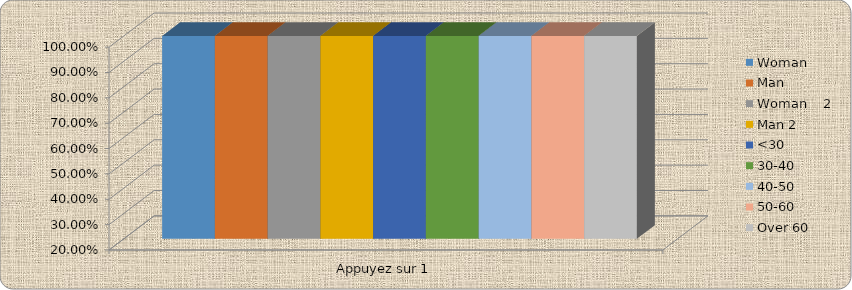
| Category | Woman     | Man  | Woman    2 | Man 2 | <30 | 30-40 | 40-50 | 50-60 | Over 60 |
|---|---|---|---|---|---|---|---|---|---|
| Appuyez sur 1 | 1 | 1 | 1 | 1 | 1 | 1 | 1 | 1 | 1 |